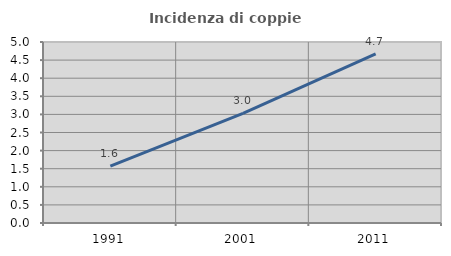
| Category | Incidenza di coppie miste |
|---|---|
| 1991.0 | 1.572 |
| 2001.0 | 3.03 |
| 2011.0 | 4.672 |